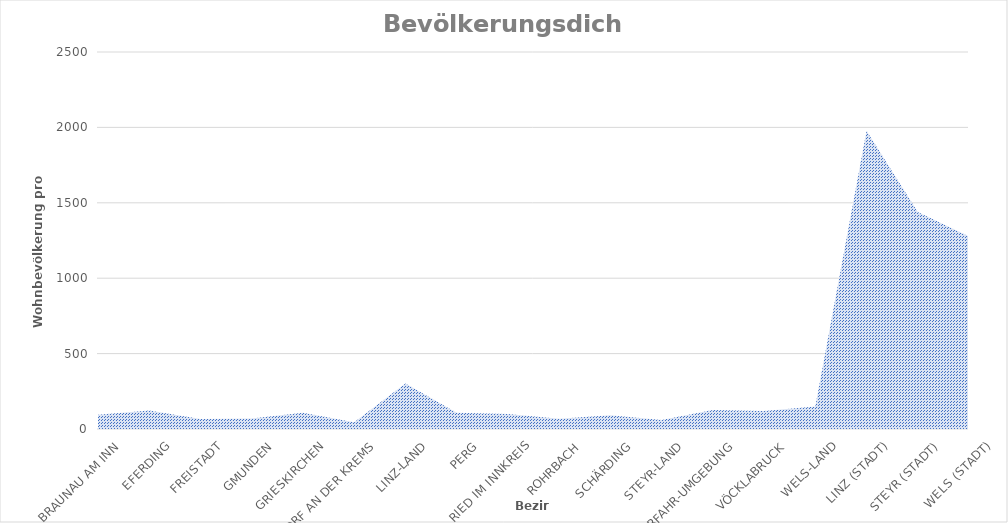
| Category | Dichte |
|---|---|
| Braunau am Inn | 94.029 |
| Eferding | 122.335 |
| Freistadt | 65.515 |
| Gmunden | 69.385 |
| Grieskirchen | 108.042 |
| Kirchdorf an der Krems | 44.812 |
| Linz-Land | 302.262 |
| Perg | 107.149 |
| Ried im Innkreis | 100.089 |
| Rohrbach | 68.468 |
| Schärding | 91.232 |
| Steyr-Land | 60.41 |
| Urfahr-Umgebung | 125.36 |
| Vöcklabruck | 120.189 |
| Wels-Land | 148.462 |
| Linz (Stadt) | 1978.423 |
| Steyr (Stadt) | 1438.441 |
| Wels (Stadt) | 1275.936 |